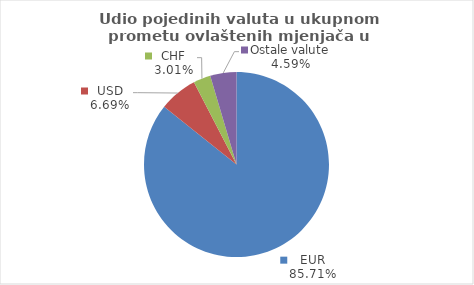
| Category | Series 0 |
|---|---|
| EUR | 85.706 |
| USD | 6.694 |
| CHF | 3.012 |
| Ostale valute | 4.588 |